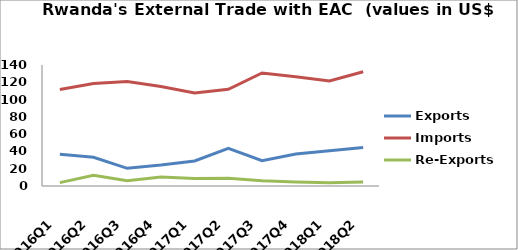
| Category | Exports | Imports | Re-Exports |
|---|---|---|---|
| 2016Q1 | 36.703 | 111.68 | 3.904 |
| 2016Q2 | 33.197 | 118.463 | 12.441 |
| 2016Q3 | 20.47 | 120.843 | 6.13 |
| 2016Q4 | 24.212 | 115.168 | 10.336 |
| 2017Q1 | 28.948 | 107.584 | 8.693 |
| 2017Q2 | 43.559 | 111.838 | 9.044 |
| 2017Q3 | 29.262 | 130.823 | 5.955 |
| 2017Q4 | 36.925 | 126.387 | 4.74 |
| 2018Q1 | 40.765 | 121.477 | 3.856 |
| 2018Q2 | 44.545 | 132.214 | 4.622 |